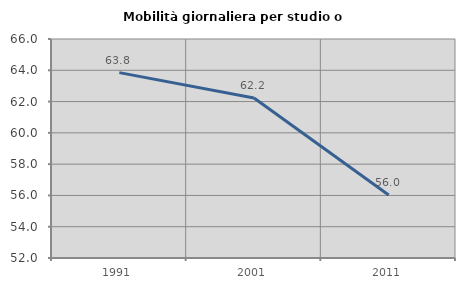
| Category | Mobilità giornaliera per studio o lavoro |
|---|---|
| 1991.0 | 63.85 |
| 2001.0 | 62.226 |
| 2011.0 | 56.022 |